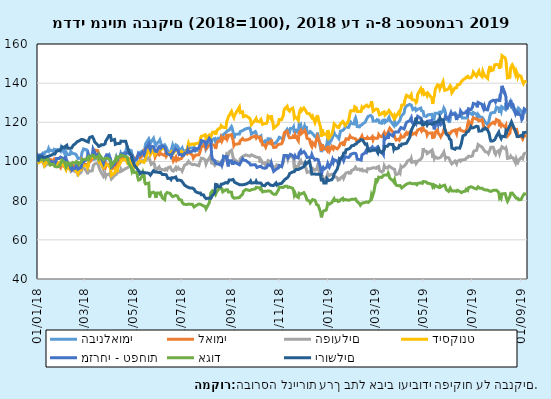
| Category | הבינלאומי | לאומי | הפועלים | דיסקונט | מזרחי - טפחות | אגוד | ירושלים |
|---|---|---|---|---|---|---|---|
| 2018-01-01 | 100 | 100 | 100 | 100 | 100 | 100 | 100 |
| 2018-01-02 | 100.056 | 100.889 | 101.009 | 100.784 | 101.064 | 100 | 102.297 |
| 2018-01-03 | 100.944 | 100.468 | 100.155 | 99.51 | 102.052 | 100.716 | 101.419 |
| 2018-01-04 | 102.75 | 100.749 | 100 | 99.902 | 103.363 | 101.126 | 102.429 |
| 2018-01-07 | 103.778 | 100.562 | 100.039 | 100.588 | 103.363 | 101.126 | 102.429 |
| 2018-01-08 | 104.361 | 100.094 | 99.612 | 100.196 | 103.271 | 100.972 | 102.429 |
| 2018-01-09 | 104.167 | 99.485 | 98.525 | 99.216 | 101.188 | 100.665 | 102.019 |
| 2018-01-10 | 104.056 | 98.971 | 97.554 | 98.041 | 102.129 | 101.024 | 101.844 |
| 2018-01-11 | 104.889 | 100.421 | 98.059 | 98.825 | 101.666 | 100.972 | 102.312 |
| 2018-01-14 | 105.278 | 101.076 | 99.03 | 100.294 | 101.82 | 101.177 | 102.575 |
| 2018-01-15 | 106.5 | 100.983 | 98.719 | 100.196 | 100.91 | 100.154 | 102.868 |
| 2018-01-16 | 105.347 | 99.672 | 98.525 | 99.119 | 99.969 | 99.13 | 102.868 |
| 2018-01-17 | 105.889 | 99.719 | 99.728 | 98.237 | 100.278 | 98.26 | 102.824 |
| 2018-01-18 | 105.986 | 100.936 | 100.155 | 98.433 | 100 | 98.567 | 103.146 |
| 2018-01-21 | 105.236 | 100.14 | 99.379 | 98.629 | 99.738 | 98.618 | 103.805 |
| 2018-01-22 | 106.25 | 101.029 | 98.447 | 98.041 | 99.506 | 98.311 | 103.819 |
| 2018-01-23 | 105.972 | 100.889 | 98.913 | 97.61 | 98.92 | 97.441 | 103.79 |
| 2018-01-24 | 106.014 | 99.485 | 98.874 | 97.943 | 99.969 | 97.544 | 103.922 |
| 2018-01-25 | 106.014 | 100 | 99.767 | 98.727 | 101.512 | 97.236 | 105.312 |
| 2018-01-28 | 106.125 | 98.877 | 99.185 | 99.412 | 101.512 | 97.441 | 105.517 |
| 2018-01-29 | 106.25 | 97.473 | 98.913 | 99.706 | 101.28 | 97.646 | 105.78 |
| 2018-01-30 | 105.278 | 96.912 | 98.486 | 99.216 | 102.283 | 98.874 | 105.795 |
| 2018-01-31 | 107.222 | 98.409 | 99.379 | 100.294 | 102.792 | 99.232 | 106.614 |
| 2018-02-01 | 106.819 | 97.941 | 98.68 | 98.923 | 101.774 | 100.614 | 107.55 |
| 2018-02-04 | 104.167 | 97.286 | 97.826 | 97.551 | 100.509 | 99.591 | 106.994 |
| 2018-02-05 | 105.292 | 99.438 | 99.573 | 97.561 | 102.592 | 98.823 | 107.682 |
| 2018-02-06 | 103.264 | 98.737 | 98.214 | 95.877 | 101.358 | 97.185 | 107.682 |
| 2018-02-07 | 104.167 | 100.094 | 98.564 | 97.365 | 101.851 | 97.851 | 108.282 |
| 2018-02-08 | 103.458 | 99.672 | 96.7 | 97.228 | 99.398 | 99.335 | 106.819 |
| 2018-02-11 | 103.611 | 97.613 | 96.04 | 95.984 | 97.964 | 98.874 | 106.819 |
| 2018-02-12 | 105.139 | 96.865 | 95.109 | 97.444 | 96.467 | 98.26 | 106.848 |
| 2018-02-13 | 104.806 | 97.941 | 95.652 | 96.572 | 95.819 | 97.799 | 106.848 |
| 2018-02-14 | 104.167 | 98.643 | 95.924 | 96.68 | 96.791 | 99.335 | 106.848 |
| 2018-02-15 | 104.222 | 97.146 | 95.342 | 96.376 | 96.189 | 98.976 | 108.282 |
| 2018-02-18 | 103.792 | 97.613 | 94.759 | 95.612 | 96.591 | 99.232 | 109.204 |
| 2018-02-19 | 103.25 | 96.256 | 95.031 | 95.495 | 98.889 | 100 | 109.541 |
| 2018-02-20 | 102.5 | 95.788 | 94.682 | 94.329 | 97.516 | 100.307 | 110.14 |
| 2018-02-21 | 101.528 | 97.333 | 93.245 | 93.692 | 96.081 | 99.591 | 110.433 |
| 2018-02-22 | 101.167 | 97.239 | 93.556 | 95.397 | 96.297 | 98.567 | 110.433 |
| 2018-02-25 | 101.819 | 96.584 | 94.526 | 95.886 | 96.961 | 99.591 | 111.209 |
| 2018-02-26 | 104.556 | 100.281 | 96.661 | 97.571 | 98.889 | 100.972 | 111.37 |
| 2018-02-27 | 105.306 | 99.86 | 98.214 | 97.914 | 99.506 | 100.921 | 111.238 |
| 2018-02-28 | 106.417 | 98.643 | 96.661 | 97.943 | 99.383 | 101.075 | 111.355 |
| 2018-03-04 | 105.944 | 98.409 | 94.915 | 97.816 | 101.049 | 101.228 | 110.258 |
| 2018-03-05 | 104.583 | 96.678 | 93.517 | 96.895 | 102.715 | 101.791 | 109.95 |
| 2018-03-06 | 102.819 | 98.971 | 95.613 | 97.943 | 103.826 | 102.354 | 109.95 |
| 2018-03-07 | 102.764 | 99.438 | 94.953 | 101.763 | 102.376 | 101.331 | 111.735 |
| 2018-03-08 | 102.792 | 99.813 | 94.488 | 102.253 | 102.869 | 102.252 | 112.365 |
| 2018-03-11 | 102.778 | 101.404 | 95.264 | 102.84 | 103.209 | 103.173 | 112.745 |
| 2018-03-12 | 102.222 | 103.884 | 97.516 | 101.959 | 106.341 | 103.224 | 112.73 |
| 2018-03-13 | 101.153 | 104.913 | 98.408 | 102.351 | 105.446 | 102.917 | 111.296 |
| 2018-03-14 | 101.153 | 105.803 | 98.253 | 101.861 | 104.782 | 101.945 | 110.053 |
| 2018-03-15 | 101.25 | 105.943 | 98.913 | 102.057 | 102.592 | 102.201 | 110.287 |
| 2018-03-18 | 101.417 | 105.522 | 98.991 | 102.351 | 103.656 | 102.508 | 108.414 |
| 2018-03-19 | 100.597 | 102.246 | 97.593 | 100.686 | 102.36 | 101.638 | 107.726 |
| 2018-03-20 | 100.694 | 101.778 | 97.127 | 101.567 | 103.132 | 103.429 | 107.55 |
| 2018-03-21 | 100.653 | 100.608 | 95.264 | 99.706 | 102.592 | 102.764 | 107.96 |
| 2018-03-22 | 99.083 | 100.562 | 95.458 | 98.727 | 102.067 | 102.508 | 108.516 |
| 2018-03-25 | 96.25 | 96.912 | 92.391 | 96.817 | 99.213 | 100.819 | 108.516 |
| 2018-03-26 | 97.528 | 98.409 | 92.624 | 96.474 | 101.049 | 100.972 | 108.575 |
| 2018-03-27 | 100.042 | 99.345 | 93.944 | 97.649 | 101.743 | 101.586 | 108.955 |
| 2018-03-28 | 99.653 | 97.567 | 92.352 | 97.453 | 102.237 | 101.586 | 110.536 |
| 2018-03-29 | 102.639 | 98.783 | 93.323 | 98.531 | 103.409 | 101.689 | 111.092 |
| 2018-04-01 | 103.583 | 98.222 | 93.284 | 97.806 | 102.962 | 101.279 | 113.243 |
| 2018-04-02 | 102.236 | 98.269 | 93.905 | 97.62 | 101.82 | 100.921 | 112.965 |
| 2018-04-03 | 101.528 | 98.783 | 93.905 | 96.259 | 100.879 | 100.051 | 113.243 |
| 2018-04-04 | 97.639 | 96.069 | 91.071 | 92.899 | 97.161 | 97.902 | 110.77 |
| 2018-04-08 | 99.611 | 96.912 | 92.896 | 94.123 | 98.72 | 100.154 | 111.253 |
| 2018-04-09 | 99.403 | 96.912 | 92.663 | 94.995 | 100.339 | 100.665 | 108.765 |
| 2018-04-10 | 100.931 | 98.315 | 93.323 | 97.062 | 101.82 | 101.894 | 109.189 |
| 2018-04-11 | 100.056 | 98.315 | 93.012 | 94.594 | 100.278 | 101.075 | 109.116 |
| 2018-04-12 | 101.806 | 99.672 | 94.526 | 96.964 | 102.237 | 102.201 | 109.277 |
| 2018-04-15 | 102.042 | 99.719 | 94.72 | 99.119 | 102.592 | 102.508 | 109.277 |
| 2018-04-16 | 104.167 | 101.263 | 96.002 | 100.098 | 103.811 | 103.275 | 110.404 |
| 2018-04-17 | 103.389 | 100.842 | 95.109 | 100.686 | 103.425 | 103.122 | 110.316 |
| 2018-04-22 | 105.056 | 101.919 | 96.39 | 101.077 | 103.903 | 102.559 | 110.316 |
| 2018-04-23 | 106.556 | 100.374 | 96.157 | 100.881 | 104.459 | 102.508 | 108.984 |
| 2018-04-24 | 106.319 | 100.374 | 96.7 | 99.412 | 104.289 | 102.201 | 107.682 |
| 2018-04-25 | 105.403 | 99.719 | 96.429 | 99.119 | 104.289 | 100.307 | 106.263 |
| 2018-04-26 | 105.972 | 101.451 | 97.244 | 100.881 | 103.78 | 98.772 | 105.092 |
| 2018-04-29 | 105.583 | 101.357 | 97.321 | 99.216 | 103.132 | 96.981 | 103.366 |
| 2018-04-30 | 103.264 | 99.672 | 95.73 | 97.845 | 101.682 | 94.882 | 101.346 |
| 2018-05-01 | 102.708 | 99.626 | 95.807 | 98.041 | 102.438 | 95.701 | 100.234 |
| 2018-05-02 | 101.542 | 100.468 | 97.399 | 98.335 | 102.222 | 95.189 | 100.176 |
| 2018-05-03 | 99.944 | 101.591 | 98.408 | 97.062 | 100.463 | 94.371 | 98.054 |
| 2018-05-06 | 101.111 | 102.012 | 97.904 | 97.943 | 101.342 | 94.626 | 96.517 |
| 2018-05-07 | 102.111 | 102.901 | 99.146 | 98.923 | 102.638 | 92.17 | 95.976 |
| 2018-05-08 | 102.778 | 102.714 | 99.185 | 99.706 | 104.135 | 90.532 | 96.225 |
| 2018-05-09 | 104.292 | 102.667 | 99.922 | 99.804 | 104.459 | 90.43 | 94.966 |
| 2018-05-10 | 104.389 | 101.872 | 99.301 | 100.294 | 103.224 | 90.737 | 93.766 |
| 2018-05-13 | 105.347 | 102.948 | 100.621 | 99.902 | 104.752 | 92.835 | 94.659 |
| 2018-05-14 | 104.444 | 104.82 | 100.932 | 100.098 | 104.227 | 94.524 | 94.952 |
| 2018-05-15 | 104.306 | 105.615 | 100.466 | 99.51 | 103.471 | 93.501 | 94.22 |
| 2018-05-16 | 106.208 | 105.896 | 100.155 | 100.196 | 104.474 | 89.304 | 94.22 |
| 2018-05-17 | 109.028 | 106.551 | 100.543 | 102.253 | 106.464 | 88.536 | 94.235 |
| 2018-05-21 | 111.556 | 107.674 | 102.019 | 106.268 | 108.994 | 88.997 | 94.015 |
| 2018-05-22 | 110.417 | 106.224 | 101.281 | 105.191 | 106.834 | 81.627 | 93.532 |
| 2018-05-23 | 109.306 | 107.347 | 101.281 | 103.428 | 105.97 | 83.828 | 93.064 |
| 2018-05-24 | 109.444 | 106.645 | 98.525 | 103.33 | 107.837 | 83.982 | 92.918 |
| 2018-05-27 | 111.833 | 106.645 | 99.418 | 106.072 | 107.529 | 84.34 | 95.303 |
| 2018-05-28 | 111.653 | 106.645 | 98.758 | 105.681 | 107.081 | 83.879 | 95.04 |
| 2018-05-29 | 108.889 | 102.293 | 96.817 | 103.722 | 105.276 | 83.47 | 94.63 |
| 2018-05-30 | 108.319 | 102.48 | 95.536 | 104.212 | 105.307 | 81.423 | 94.63 |
| 2018-05-31 | 109.292 | 104.024 | 95.536 | 105.289 | 105.091 | 83.93 | 94.615 |
| 2018-06-03 | 110.333 | 103.369 | 97.244 | 106.366 | 107.513 | 83.93 | 94.381 |
| 2018-06-04 | 111.083 | 104.679 | 96.002 | 106.954 | 107.22 | 83.367 | 94.366 |
| 2018-06-05 | 109.806 | 103.837 | 96.429 | 106.464 | 106.773 | 83.879 | 94.381 |
| 2018-06-06 | 107.778 | 103.65 | 96.079 | 106.17 | 106.31 | 83.521 | 94.235 |
| 2018-06-07 | 107.778 | 103.697 | 96.196 | 106.758 | 107.93 | 81.423 | 93.386 |
| 2018-06-10 | 108.569 | 103.042 | 95.536 | 106.562 | 107.297 | 80.502 | 93.371 |
| 2018-06-11 | 108.25 | 104.118 | 96.234 | 106.268 | 106.464 | 83.163 | 92.903 |
| 2018-06-12 | 107.361 | 102.667 | 95.73 | 105.093 | 104.782 | 83.009 | 93.225 |
| 2018-06-13 | 106.264 | 102.246 | 95.691 | 104.799 | 103.826 | 84.186 | 93.064 |
| 2018-06-14 | 105.139 | 103.931 | 96.817 | 103.526 | 103.44 | 84.596 | 91.352 |
| 2018-06-17 | 103.917 | 103.463 | 97.205 | 104.114 | 103.44 | 83.675 | 91.425 |
| 2018-06-18 | 105.472 | 103.837 | 96.312 | 104.016 | 102.453 | 82.907 | 90.825 |
| 2018-06-19 | 105.694 | 102.808 | 95.497 | 105.093 | 102.823 | 82.702 | 91.703 |
| 2018-06-20 | 108.333 | 102.153 | 95.885 | 105.387 | 104.335 | 82.088 | 91.63 |
| 2018-06-21 | 106.972 | 100.281 | 95.109 | 104.31 | 104.767 | 82.497 | 91.63 |
| 2018-06-24 | 108.528 | 102.246 | 96.933 | 105.975 | 106.526 | 82.651 | 92.098 |
| 2018-06-25 | 108.125 | 100.608 | 95.924 | 105.877 | 105.94 | 82.242 | 91.001 |
| 2018-06-26 | 107.972 | 101.076 | 96.002 | 105.289 | 105.446 | 82.344 | 90.357 |
| 2018-06-27 | 107.361 | 101.591 | 96.817 | 105.779 | 105.631 | 81.576 | 90.708 |
| 2018-06-28 | 106.042 | 101.076 | 96.079 | 104.505 | 103.625 | 80.604 | 90.533 |
| 2018-07-01 | 106.333 | 101.544 | 95.963 | 105.191 | 103.595 | 80.348 | 90.225 |
| 2018-07-02 | 106.944 | 101.731 | 95.148 | 105.191 | 102.977 | 79.171 | 89.699 |
| 2018-07-03 | 105.667 | 102.901 | 96.118 | 104.31 | 103.348 | 78.864 | 89.713 |
| 2018-07-04 | 104.875 | 103.182 | 96.584 | 104.016 | 103.163 | 78.199 | 88.543 |
| 2018-07-05 | 105.389 | 104.352 | 98.175 | 104.016 | 104.181 | 77.738 | 87.943 |
| 2018-07-08 | 105.972 | 103.837 | 98.68 | 105.583 | 104.674 | 77.994 | 87.123 |
| 2018-07-09 | 106.583 | 105.288 | 99.495 | 107.738 | 106.001 | 78.147 | 87.079 |
| 2018-07-10 | 107.403 | 105.803 | 100.078 | 109.403 | 104.782 | 78.301 | 86.757 |
| 2018-07-11 | 106.819 | 104.445 | 99.262 | 108.423 | 104.397 | 78.147 | 86.626 |
| 2018-07-12 | 107.222 | 104.352 | 99.146 | 108.913 | 104.813 | 78.147 | 86.435 |
| 2018-07-15 | 106.944 | 103.229 | 98.37 | 109.011 | 105.338 | 78.147 | 86.435 |
| 2018-07-16 | 106.528 | 101.778 | 98.408 | 109.011 | 105.677 | 77.277 | 86.64 |
| 2018-07-17 | 107.361 | 102.34 | 98.525 | 108.521 | 106.248 | 76.766 | 85.85 |
| 2018-07-18 | 106.264 | 102.808 | 98.408 | 109.011 | 105.677 | 76.868 | 85.177 |
| 2018-07-19 | 105.569 | 103.276 | 98.331 | 109.207 | 106.449 | 77.38 | 84.548 |
| 2018-07-23 | 105.792 | 103.416 | 97.865 | 109.305 | 106.788 | 78.301 | 83.86 |
| 2018-07-24 | 106.944 | 104.352 | 99.418 | 109.892 | 108.13 | 78.045 | 83.816 |
| 2018-07-25 | 107.778 | 105.803 | 100.349 | 111.655 | 108.886 | 78.147 | 83.889 |
| 2018-07-26 | 109.028 | 107.394 | 101.708 | 112.831 | 110.691 | 77.789 | 83.055 |
| 2018-07-29 | 110.014 | 107.861 | 101.436 | 113.222 | 110.29 | 77.277 | 82.953 |
| 2018-07-30 | 110.292 | 108.985 | 101.708 | 113.614 | 110.691 | 77.175 | 81.958 |
| 2018-07-31 | 109.681 | 107.628 | 100.738 | 113.614 | 110.043 | 76.97 | 81.738 |
| 2018-08-01 | 106.25 | 106.458 | 98.797 | 111.851 | 108.362 | 75.844 | 81.051 |
| 2018-08-02 | 106.431 | 106.972 | 99.845 | 111.557 | 109.55 | 76.049 | 81.08 |
| 2018-08-05 | 108.819 | 108.329 | 101.708 | 113.516 | 111.802 | 78.864 | 81.329 |
| 2018-08-06 | 109.083 | 108.47 | 102.329 | 113.222 | 111.694 | 80.962 | 81.212 |
| 2018-08-07 | 109.444 | 108.563 | 103.183 | 112.537 | 110.737 | 83.982 | 81.212 |
| 2018-08-08 | 110.222 | 108.517 | 98.602 | 113.614 | 103.517 | 84.033 | 81.212 |
| 2018-08-09 | 111.222 | 108.563 | 99.845 | 114.887 | 101.311 | 85.005 | 82.616 |
| 2018-08-12 | 111.736 | 108.189 | 98.02 | 115.083 | 100.432 | 84.135 | 84.094 |
| 2018-08-13 | 109.819 | 106.411 | 98.02 | 113.614 | 99.044 | 83.214 | 88.308 |
| 2018-08-14 | 109.028 | 108.563 | 99.146 | 115.181 | 98.858 | 84.084 | 88.513 |
| 2018-08-15 | 110.764 | 109.64 | 99.961 | 114.985 | 98.858 | 84.289 | 88.147 |
| 2018-08-16 | 111.847 | 110.295 | 100.116 | 116.454 | 98.565 | 85.517 | 87.065 |
| 2018-08-19 | 111.819 | 110.295 | 99.185 | 117.14 | 98.272 | 86.336 | 87.065 |
| 2018-08-20 | 112.917 | 111.839 | 99.495 | 118.315 | 99.259 | 86.438 | 88.382 |
| 2018-08-21 | 112.361 | 110.482 | 98.408 | 117.826 | 98.118 | 86.131 | 87.987 |
| 2018-08-22 | 112.361 | 110.108 | 98.447 | 117.532 | 99.537 | 84.493 | 88.484 |
| 2018-08-23 | 113.764 | 112.307 | 101.087 | 117.826 | 102.669 | 84.442 | 88.908 |
| 2018-08-26 | 114.931 | 111.558 | 101.242 | 117.238 | 102.129 | 85.619 | 89.26 |
| 2018-08-27 | 115.278 | 114.085 | 103.921 | 120.47 | 103.193 | 86.029 | 88.835 |
| 2018-08-28 | 115.722 | 111.839 | 103.688 | 121.352 | 99.059 | 85.619 | 88.996 |
| 2018-08-29 | 115.986 | 112.775 | 103.416 | 122.723 | 97.501 | 84.442 | 89.508 |
| 2018-08-30 | 116.014 | 113.383 | 104.891 | 123.408 | 100.417 | 84.34 | 90.562 |
| 2018-09-02 | 117.847 | 113.711 | 105.745 | 125.563 | 100.417 | 84.34 | 90.562 |
| 2018-09-03 | 116.847 | 111.979 | 105.396 | 124.192 | 98.966 | 82.19 | 90.825 |
| 2018-09-04 | 114.833 | 110.997 | 101.98 | 124.486 | 99.275 | 82.344 | 90.825 |
| 2018-09-05 | 111.819 | 108.095 | 99.534 | 122.429 | 99.044 | 81.269 | 90.386 |
| 2018-09-06 | 113.889 | 108.751 | 100.932 | 123.702 | 99.661 | 81.627 | 89.362 |
| 2018-09-12 | 114.042 | 109.125 | 99.107 | 127.816 | 98.334 | 81.576 | 88.162 |
| 2018-09-13 | 115.278 | 110.622 | 101.436 | 124.976 | 98.812 | 82.19 | 88.279 |
| 2018-09-16 | 115.792 | 111.699 | 102.562 | 125.367 | 101.388 | 83.316 | 88.118 |
| 2018-09-17 | 115.333 | 111.044 | 102.756 | 122.919 | 100.756 | 84.749 | 87.811 |
| 2018-09-20 | 116.736 | 110.903 | 103.377 | 123.408 | 100.494 | 85.722 | 88.396 |
| 2018-09-25 | 117.125 | 111.558 | 102.679 | 122.037 | 98.982 | 85.159 | 89.479 |
| 2018-09-26 | 115.903 | 112.12 | 102.873 | 121.058 | 98.226 | 85.312 | 90.035 |
| 2018-09-27 | 114.014 | 112.26 | 103.416 | 118.805 | 98.303 | 85.619 | 89.025 |
| 2018-10-02 | 115.278 | 113.009 | 102.446 | 121.254 | 98.349 | 86.029 | 89.157 |
| 2018-10-03 | 114.403 | 112.073 | 102.562 | 121.939 | 98.673 | 86.796 | 89.962 |
| 2018-10-04 | 112.361 | 112.775 | 102.174 | 120.568 | 96.945 | 86.694 | 89.069 |
| 2018-10-07 | 112.458 | 112.307 | 101.941 | 120.274 | 97.439 | 86.592 | 89.055 |
| 2018-10-08 | 112.306 | 111.184 | 99.457 | 120.274 | 96.945 | 85.977 | 88.879 |
| 2018-10-09 | 113.056 | 111.745 | 100.854 | 121.45 | 97.532 | 86.54 | 88.967 |
| 2018-10-10 | 110.278 | 110.154 | 100.311 | 120.274 | 97.516 | 86.285 | 88.952 |
| 2018-10-11 | 109.569 | 108.47 | 98.991 | 119.001 | 96.745 | 84.493 | 87.811 |
| 2018-10-14 | 110.486 | 108.329 | 99.301 | 119.393 | 96.56 | 84.8 | 87.621 |
| 2018-10-15 | 109.528 | 107.394 | 97.981 | 119.491 | 96.051 | 85.005 | 87.621 |
| 2018-10-16 | 109.847 | 108.47 | 98.952 | 119.491 | 96.822 | 84.8 | 88.689 |
| 2018-10-17 | 110 | 108.563 | 99.612 | 120.176 | 97.701 | 85.107 | 88.543 |
| 2018-10-18 | 111.639 | 109.686 | 100.466 | 123.115 | 98.426 | 84.954 | 88.952 |
| 2018-10-21 | 111.458 | 109.125 | 99.922 | 122.037 | 97.794 | 84.852 | 87.913 |
| 2018-10-22 | 111.944 | 111.184 | 100.155 | 123.604 | 99.136 | 85.005 | 88.221 |
| 2018-10-23 | 109.028 | 109.172 | 98.214 | 120.96 | 97.424 | 83.828 | 87.796 |
| 2018-10-24 | 109.028 | 108.563 | 97.05 | 120.078 | 97.115 | 83.828 | 87.796 |
| 2018-10-25 | 109.167 | 107.16 | 96.661 | 117.042 | 94.955 | 83.316 | 87.796 |
| 2018-10-28 | 109.556 | 107.3 | 97.438 | 118.022 | 96.02 | 83.316 | 89.025 |
| 2018-10-29 | 109.722 | 108.095 | 98.214 | 117.63 | 96.39 | 84.084 | 87.957 |
| 2018-10-31 | 111.375 | 108.657 | 97.826 | 119.197 | 96.699 | 85.415 | 88.484 |
| 2018-11-01 | 112.361 | 108.985 | 97.438 | 121.45 | 97.933 | 86.899 | 88.821 |
| 2018-11-04 | 111.875 | 109.078 | 97.36 | 121.352 | 97.377 | 86.796 | 88.835 |
| 2018-11-05 | 111.542 | 109.78 | 97.748 | 121.45 | 98.936 | 86.796 | 89.04 |
| 2018-11-06 | 111.111 | 111.839 | 99.379 | 123.31 | 100.586 | 86.745 | 89.874 |
| 2018-11-07 | 112.375 | 114.085 | 101.669 | 126.151 | 103.055 | 86.847 | 90.196 |
| 2018-11-08 | 114.583 | 114.927 | 102.834 | 126.934 | 103.44 | 87.359 | 90.781 |
| 2018-11-11 | 116.444 | 115.489 | 102.562 | 128.208 | 103.008 | 87.308 | 91.645 |
| 2018-11-12 | 115.694 | 113.758 | 100.97 | 126.543 | 101.851 | 86.745 | 91.747 |
| 2018-11-13 | 115.389 | 112.775 | 102.096 | 126.934 | 102.438 | 87.001 | 92.61 |
| 2018-11-14 | 114.944 | 112.073 | 102.368 | 125.759 | 102.746 | 86.95 | 93.81 |
| 2018-11-15 | 116.833 | 111.839 | 102.679 | 126.543 | 103.656 | 86.54 | 94.191 |
| 2018-11-18 | 116.958 | 112.26 | 102.019 | 127.228 | 102.977 | 86.285 | 94.674 |
| 2018-11-19 | 117.667 | 113.711 | 102.873 | 125.661 | 103.317 | 85.261 | 94.82 |
| 2018-11-20 | 114.486 | 111.605 | 97.089 | 122.331 | 101.82 | 82.805 | 94.805 |
| 2018-11-21 | 116.653 | 113.477 | 97.826 | 122.919 | 102.9 | 83.623 | 95.113 |
| 2018-11-22 | 115.278 | 112.635 | 97.787 | 122.429 | 102.175 | 82.446 | 95.888 |
| 2018-11-25 | 114.833 | 110.622 | 96.894 | 121.058 | 101.82 | 81.627 | 95.888 |
| 2018-11-26 | 119 | 114.693 | 99.495 | 124.29 | 104.289 | 83.777 | 96.269 |
| 2018-11-27 | 118.125 | 114.506 | 99.922 | 126.053 | 104.906 | 83.419 | 96.283 |
| 2018-11-28 | 118.722 | 115.77 | 100.505 | 126.738 | 105.523 | 83.316 | 96.576 |
| 2018-11-29 | 116.389 | 114.272 | 98.991 | 125.857 | 104.212 | 83.47 | 96.722 |
| 2018-12-02 | 116.917 | 115.349 | 99.301 | 127.326 | 105.045 | 84.084 | 97.351 |
| 2018-12-03 | 118.194 | 115.863 | 98.835 | 127.816 | 105.045 | 83.93 | 97.556 |
| 2018-12-04 | 117.125 | 115.021 | 97.127 | 126.151 | 104.042 | 82.651 | 99.488 |
| 2018-12-05 | 118.056 | 113.664 | 96.079 | 126.347 | 104.443 | 81.525 | 98.771 |
| 2018-12-06 | 114.25 | 111.792 | 94.449 | 124.584 | 102.067 | 80.297 | 98.771 |
| 2018-12-09 | 114.722 | 111.371 | 94.837 | 124.388 | 102.175 | 79.836 | 100.337 |
| 2018-12-10 | 115.278 | 109.686 | 94.915 | 124.388 | 102.607 | 78.864 | 98.347 |
| 2018-12-11 | 115.111 | 108.423 | 94.022 | 123.017 | 102.083 | 79.427 | 96.327 |
| 2018-12-12 | 114.639 | 107.674 | 94.992 | 122.429 | 103.487 | 80.041 | 93.606 |
| 2018-12-13 | 114.167 | 109.499 | 96.467 | 123.115 | 102.345 | 80.553 | 93.649 |
| 2018-12-16 | 112.722 | 108.095 | 95.497 | 119.882 | 100.771 | 80.194 | 93.562 |
| 2018-12-17 | 112.222 | 110.108 | 95.963 | 121.156 | 101.203 | 79.324 | 93.562 |
| 2018-12-18 | 112.014 | 110.482 | 96.079 | 121.156 | 101.203 | 77.994 | 93.518 |
| 2018-12-19 | 114.722 | 112.728 | 97.516 | 123.702 | 101.512 | 77.943 | 93.796 |
| 2018-12-20 | 112.611 | 113.009 | 97.05 | 121.743 | 100.895 | 77.636 | 93.547 |
| 2018-12-23 | 107.042 | 108.563 | 92.857 | 117.532 | 96.729 | 74.002 | 93.284 |
| 2018-12-24 | 104.792 | 105.335 | 89.674 | 112.635 | 92.873 | 71.494 | 90.752 |
| 2018-12-25 | 107.667 | 108.797 | 92.896 | 116.357 | 96.267 | 73.081 | 90.752 |
| 2018-12-26 | 107.222 | 108.797 | 93.362 | 114.887 | 96.884 | 74.258 | 90.752 |
| 2018-12-27 | 106.25 | 106.738 | 90.567 | 113.81 | 96.02 | 74.77 | 89.069 |
| 2018-12-30 | 107.319 | 106.317 | 91.304 | 114.202 | 96.868 | 75.179 | 89.069 |
| 2018-12-31 | 109.167 | 105.756 | 91.809 | 113.222 | 97.408 | 76.51 | 91.294 |
| 2019-01-01 | 111.944 | 108.002 | 93.711 | 116.063 | 98.828 | 78.71 | 91.513 |
| 2019-01-02 | 110.153 | 106.224 | 92.702 | 114.3 | 97.67 | 78.301 | 90.284 |
| 2019-01-03 | 109.069 | 105.194 | 92.197 | 112.243 | 97.007 | 78.199 | 90.591 |
| 2019-01-06 | 111.208 | 107.628 | 93.517 | 113.908 | 99.522 | 78.966 | 90.679 |
| 2019-01-07 | 112.361 | 107.019 | 93.634 | 113.908 | 100.895 | 79.683 | 90.855 |
| 2019-01-08 | 112.403 | 106.411 | 92.935 | 116.748 | 99.661 | 80.399 | 91.879 |
| 2019-01-09 | 114.708 | 107.487 | 93.129 | 119.197 | 100.895 | 81.013 | 93.649 |
| 2019-01-10 | 113.694 | 107.394 | 92.275 | 118.707 | 101.234 | 79.99 | 93.81 |
| 2019-01-13 | 112.736 | 106.458 | 91.693 | 117.532 | 100.201 | 80.297 | 96.166 |
| 2019-01-14 | 112.778 | 106.224 | 90.489 | 117.826 | 99.013 | 79.58 | 97.673 |
| 2019-01-15 | 111.667 | 107.44 | 90.528 | 117.336 | 100.694 | 79.376 | 99.532 |
| 2019-01-16 | 113.542 | 107.861 | 90.8 | 118.511 | 99.877 | 79.836 | 99.781 |
| 2019-01-17 | 115.486 | 109.219 | 91.537 | 119.197 | 101.496 | 80.45 | 101.449 |
| 2019-01-20 | 115.889 | 109.64 | 92.508 | 120.47 | 101.496 | 81.218 | 102.853 |
| 2019-01-21 | 115.444 | 107.908 | 91.421 | 119.882 | 100.432 | 80.194 | 104.317 |
| 2019-01-22 | 116.681 | 109.312 | 92.314 | 119.98 | 101.589 | 79.99 | 104.331 |
| 2019-01-23 | 117.75 | 110.435 | 93.595 | 118.413 | 102.438 | 80.604 | 104.287 |
| 2019-01-24 | 117.25 | 111.605 | 94.138 | 119.001 | 101.944 | 80.604 | 106.014 |
| 2019-01-27 | 117.375 | 111.277 | 94.526 | 120.666 | 102.036 | 80.194 | 106.38 |
| 2019-01-28 | 118.194 | 111.605 | 93.944 | 122.429 | 102.036 | 80.348 | 106.541 |
| 2019-01-29 | 119.319 | 113.009 | 94.138 | 124.682 | 102.746 | 80.399 | 106.833 |
| 2019-01-30 | 120 | 112.307 | 94.138 | 125.955 | 103.703 | 80.809 | 107.009 |
| 2019-01-31 | 119.375 | 112.26 | 95.458 | 125.661 | 104.15 | 80.706 | 108.019 |
| 2019-02-03 | 119.167 | 111.839 | 95.963 | 125.857 | 104.212 | 80.655 | 108.209 |
| 2019-02-04 | 121.194 | 111.699 | 96.157 | 127.914 | 104.011 | 80.809 | 108.721 |
| 2019-02-05 | 122.222 | 111.605 | 97.127 | 128.404 | 104.119 | 80.911 | 108.984 |
| 2019-02-06 | 120.833 | 110.716 | 96.856 | 127.326 | 103.348 | 80.143 | 109.014 |
| 2019-02-07 | 117.847 | 110.482 | 95.924 | 125.563 | 101.142 | 79.529 | 109.643 |
| 2019-02-10 | 117.667 | 110.997 | 96.157 | 125.465 | 101.018 | 78.454 | 110.433 |
| 2019-02-11 | 118.472 | 111.418 | 95.575 | 125.759 | 101.018 | 77.687 | 110.594 |
| 2019-02-12 | 118.667 | 112.26 | 95.691 | 125.563 | 100.741 | 78.199 | 111.209 |
| 2019-02-13 | 118.708 | 113.009 | 96.002 | 127.62 | 103.379 | 78.71 | 110.872 |
| 2019-02-14 | 119.264 | 111.699 | 95.186 | 127.032 | 103.826 | 78.915 | 110.872 |
| 2019-02-17 | 120.028 | 111.745 | 95.303 | 128.208 | 104.443 | 79.12 | 108.838 |
| 2019-02-18 | 120.931 | 111.839 | 94.915 | 128.208 | 105.338 | 79.427 | 108.999 |
| 2019-02-19 | 121.361 | 111.652 | 94.876 | 128.795 | 104.813 | 79.376 | 108.984 |
| 2019-02-20 | 122.583 | 112.307 | 96.273 | 128.893 | 105.924 | 79.58 | 108.984 |
| 2019-02-21 | 123.111 | 111.745 | 96.39 | 127.914 | 106.449 | 79.069 | 105.341 |
| 2019-02-24 | 123.514 | 111.745 | 96.351 | 128.697 | 106.68 | 80.297 | 105.356 |
| 2019-02-25 | 123.889 | 112.026 | 96.196 | 130.754 | 106.942 | 82.907 | 105.429 |
| 2019-02-26 | 122.681 | 112.681 | 96.7 | 128.208 | 107.467 | 81.883 | 105.751 |
| 2019-02-27 | 120.625 | 111.137 | 96.661 | 125.661 | 106.68 | 82.139 | 105.751 |
| 2019-02-28 | 120.694 | 112.167 | 96.856 | 125.465 | 107.097 | 84.442 | 105.751 |
| 2019-03-03 | 120.722 | 111.792 | 96.506 | 126.836 | 106.757 | 91.505 | 105.882 |
| 2019-03-04 | 121.361 | 112.167 | 97.089 | 126.934 | 107.019 | 89.867 | 105.399 |
| 2019-03-05 | 121.806 | 111.979 | 96.972 | 126.543 | 107.529 | 90.532 | 104.419 |
| 2019-03-06 | 121.111 | 113.711 | 97.438 | 126.347 | 106.896 | 92.016 | 106.175 |
| 2019-03-07 | 119.861 | 113.102 | 95.536 | 123.8 | 105.214 | 92.119 | 105.209 |
| 2019-03-10 | 119.542 | 112.635 | 94.604 | 124.388 | 104.952 | 91.863 | 104.404 |
| 2019-03-11 | 121.306 | 113.243 | 94.72 | 125.073 | 104.597 | 91.863 | 105.034 |
| 2019-03-12 | 119.514 | 113.664 | 95.303 | 124.78 | 103.579 | 92.886 | 105.312 |
| 2019-03-13 | 121.764 | 114.787 | 97.787 | 125.367 | 112.095 | 93.142 | 106.087 |
| 2019-03-14 | 119.972 | 113.711 | 96.972 | 123.702 | 111.308 | 93.142 | 107.711 |
| 2019-03-17 | 120.931 | 114.272 | 96.623 | 124.878 | 112.82 | 92.989 | 107.741 |
| 2019-03-18 | 120.833 | 114.74 | 97.05 | 125.073 | 111.54 | 94.063 | 107.755 |
| 2019-03-19 | 122.5 | 116.004 | 97.632 | 126.053 | 114.27 | 93.04 | 108.838 |
| 2019-03-20 | 121.111 | 116.94 | 97.787 | 125.759 | 113.792 | 91.505 | 108.853 |
| 2019-03-24 | 119.028 | 115.021 | 96.273 | 123.115 | 112.959 | 90.123 | 108.677 |
| 2019-03-25 | 118.472 | 113.945 | 95.846 | 122.233 | 113.005 | 89.56 | 106.321 |
| 2019-03-26 | 120.694 | 112.915 | 96.002 | 123.408 | 114.934 | 90.686 | 107.272 |
| 2019-03-27 | 119.736 | 111.652 | 93.944 | 122.429 | 115.088 | 88.997 | 107.272 |
| 2019-03-28 | 118.708 | 110.95 | 93.284 | 122.723 | 115.088 | 87.922 | 106.409 |
| 2019-03-31 | 120.028 | 111.465 | 93.75 | 125.073 | 115.088 | 87.615 | 106.921 |
| 2019-04-01 | 120.417 | 110.95 | 94.915 | 124.388 | 116.014 | 88.025 | 108.267 |
| 2019-04-02 | 121.181 | 111.933 | 94.255 | 124.388 | 115.72 | 87.718 | 108.019 |
| 2019-04-03 | 122.958 | 113.102 | 97.438 | 126.934 | 117.325 | 87.615 | 108.092 |
| 2019-04-04 | 123.361 | 112.354 | 96.894 | 128.795 | 116.831 | 86.489 | 108.941 |
| 2019-04-07 | 124.722 | 112.588 | 97.632 | 128.991 | 116.631 | 87.462 | 108.999 |
| 2019-04-08 | 127.139 | 113.711 | 97.943 | 131.44 | 117.078 | 87.564 | 109.058 |
| 2019-04-10 | 128.361 | 114.74 | 99.107 | 133.79 | 120.009 | 88.434 | 109.35 |
| 2019-04-11 | 128.389 | 113.945 | 100.155 | 133.301 | 120.333 | 88.792 | 109.716 |
| 2019-04-14 | 129.181 | 114.974 | 100.854 | 132.713 | 120.781 | 89.048 | 112.248 |
| 2019-04-15 | 128.764 | 114.319 | 100.311 | 132.713 | 120.642 | 88.639 | 114.486 |
| 2019-04-16 | 128.764 | 115.302 | 101.475 | 134.084 | 122.354 | 88.792 | 115.818 |
| 2019-04-17 | 127.778 | 113.711 | 99.573 | 131.636 | 120.102 | 88.69 | 115.745 |
| 2019-04-18 | 126.514 | 113.243 | 99.651 | 131.44 | 119.485 | 88.639 | 117.632 |
| 2019-04-21 | 127.208 | 114.6 | 100.078 | 131.244 | 120.333 | 88.741 | 119.696 |
| 2019-04-22 | 126.014 | 114.038 | 98.913 | 130.069 | 119.562 | 88.588 | 122.403 |
| 2019-04-23 | 126.181 | 114.319 | 98.874 | 130.656 | 121.66 | 88.127 | 119.842 |
| 2019-04-24 | 126.639 | 116.051 | 100.155 | 134.28 | 123.11 | 88.843 | 119.842 |
| 2019-04-28 | 127.278 | 116.752 | 101.203 | 137.12 | 122.077 | 89.099 | 119.681 |
| 2019-04-29 | 125.889 | 115.629 | 101.747 | 135.749 | 120.333 | 89.406 | 120.457 |
| 2019-04-30 | 125.486 | 115.161 | 102.679 | 137.316 | 120.009 | 88.843 | 118.701 |
| 2019-05-01 | 125.556 | 116.986 | 106.793 | 137.12 | 120.333 | 89.765 | 118.803 |
| 2019-05-02 | 123.264 | 115.91 | 105.396 | 134.182 | 119.67 | 89.867 | 118.803 |
| 2019-05-05 | 123.056 | 115.395 | 105.202 | 134.868 | 120.102 | 89.509 | 119.988 |
| 2019-05-06 | 122.569 | 113.57 | 104.037 | 133.692 | 119.176 | 88.997 | 118.73 |
| 2019-05-07 | 123.847 | 114.413 | 104.193 | 134.77 | 120.595 | 89.048 | 119.257 |
| 2019-05-12 | 124.097 | 114.6 | 105.784 | 132.321 | 120.95 | 88.383 | 119.257 |
| 2019-05-13 | 121.181 | 111.558 | 101.902 | 129.383 | 118.189 | 87.103 | 119.593 |
| 2019-05-14 | 122.917 | 113.664 | 103.261 | 132.615 | 119.639 | 87.769 | 119.286 |
| 2019-05-15 | 122.347 | 112.307 | 101.553 | 133.203 | 116.461 | 87.052 | 119.974 |
| 2019-05-16 | 124.597 | 114.834 | 102.446 | 136.631 | 118.204 | 87.82 | 119.798 |
| 2019-05-19 | 124.583 | 116.051 | 101.63 | 139.177 | 120.333 | 87.052 | 120.266 |
| 2019-05-20 | 124.722 | 114.319 | 101.669 | 139.177 | 118.945 | 87.001 | 120.281 |
| 2019-05-21 | 124.236 | 113.851 | 101.786 | 138.883 | 120.349 | 86.745 | 120.281 |
| 2019-05-22 | 125.875 | 113.43 | 101.747 | 137.12 | 119.67 | 87.564 | 122.3 |
| 2019-05-23 | 124.431 | 112.588 | 102.174 | 136.631 | 118.945 | 86.95 | 121.349 |
| 2019-05-26 | 125.764 | 114.693 | 104.037 | 140.744 | 120.642 | 87.666 | 121.364 |
| 2019-05-27 | 127.222 | 116.285 | 104.814 | 138.198 | 120.827 | 88.025 | 120.939 |
| 2019-05-28 | 126.458 | 116.986 | 104.503 | 136.337 | 121.598 | 87.922 | 116.696 |
| 2019-05-29 | 125 | 115.115 | 101.514 | 136.239 | 123.11 | 87.052 | 115.569 |
| 2019-05-30 | 121.667 | 114.506 | 102.174 | 136.533 | 123.234 | 85.67 | 114.033 |
| 2019-06-02 | 120.819 | 114.46 | 101.902 | 137.12 | 121.567 | 84.749 | 112.95 |
| 2019-06-03 | 119.722 | 113.898 | 101.203 | 138.1 | 122.94 | 84.903 | 111.56 |
| 2019-06-04 | 122.917 | 114.085 | 100.155 | 138.688 | 123.264 | 86.387 | 111.955 |
| 2019-06-05 | 123.806 | 114.834 | 100.155 | 138.002 | 125.039 | 86.131 | 110.872 |
| 2019-06-06 | 124.028 | 115.489 | 98.797 | 135.162 | 124.02 | 84.954 | 106.863 |
| 2019-06-10 | 124.861 | 116.051 | 100.233 | 137.61 | 124.267 | 85.005 | 106.248 |
| 2019-06-11 | 124.833 | 115.723 | 99.573 | 137.12 | 123.079 | 85.005 | 106.877 |
| 2019-06-12 | 123.778 | 114.132 | 98.835 | 137.61 | 121.182 | 84.8 | 106.907 |
| 2019-06-13 | 123.181 | 116.238 | 100.155 | 139.177 | 123.064 | 85.312 | 106.877 |
| 2019-06-16 | 123.194 | 116.799 | 100.738 | 139.373 | 123.156 | 84.698 | 106.819 |
| 2019-06-17 | 123.194 | 115.957 | 100.155 | 140.059 | 125.733 | 84.442 | 107.214 |
| 2019-06-18 | 123.472 | 116.097 | 100.116 | 140.744 | 125.039 | 84.084 | 109.175 |
| 2019-06-19 | 122.208 | 115.629 | 100.854 | 140.353 | 124.545 | 84.289 | 111.238 |
| 2019-06-20 | 121.736 | 115.863 | 100.738 | 141.724 | 124.576 | 84.596 | 113.126 |
| 2019-06-23 | 122.222 | 115.115 | 101.009 | 142.409 | 124.915 | 84.852 | 113.652 |
| 2019-06-24 | 121.833 | 116.004 | 101.708 | 142.997 | 125.486 | 85.824 | 114.413 |
| 2019-06-25 | 122.181 | 116.565 | 101.786 | 143.095 | 124.823 | 85.415 | 115.174 |
| 2019-06-26 | 122.639 | 119.186 | 102.057 | 143.487 | 124.19 | 85.261 | 114.896 |
| 2019-06-27 | 125.292 | 120.543 | 102.717 | 142.703 | 126.921 | 86.643 | 115.364 |
| 2019-06-30 | 124.444 | 118.39 | 102.562 | 142.703 | 126.504 | 87.103 | 117.764 |
| 2019-07-01 | 124.208 | 119.467 | 102.096 | 143.389 | 127.06 | 86.899 | 117.12 |
| 2019-07-02 | 123.833 | 121.526 | 102.873 | 143.976 | 127.846 | 86.796 | 117.12 |
| 2019-07-03 | 125.028 | 122.321 | 104.697 | 145.642 | 129.636 | 86.745 | 117.237 |
| 2019-07-04 | 124.972 | 122.181 | 105.396 | 145.348 | 129.821 | 86.387 | 117.062 |
| 2019-07-07 | 124.125 | 121.666 | 105.668 | 143.487 | 129.127 | 85.977 | 118.042 |
| 2019-07-08 | 122.708 | 121.479 | 106.949 | 143.389 | 127.677 | 86.233 | 117.881 |
| 2019-07-09 | 124.028 | 121.432 | 108.657 | 145.348 | 130.16 | 87.052 | 117.779 |
| 2019-07-10 | 124.306 | 120.73 | 108.502 | 146.131 | 130.253 | 86.643 | 115.511 |
| 2019-07-11 | 122.778 | 121.198 | 108.075 | 144.564 | 129.759 | 86.387 | 115.335 |
| 2019-07-14 | 122.583 | 121.338 | 107.337 | 143.389 | 129.189 | 86.336 | 115.686 |
| 2019-07-15 | 122.917 | 119.747 | 107.065 | 146.033 | 127.707 | 86.029 | 116.594 |
| 2019-07-16 | 121.458 | 117.876 | 106.134 | 145.837 | 126.813 | 85.722 | 116.594 |
| 2019-07-17 | 121.139 | 116.94 | 106.289 | 143.976 | 128.124 | 85.722 | 116.506 |
| 2019-07-18 | 120 | 117.033 | 104.969 | 143.879 | 126.581 | 85.466 | 117.135 |
| 2019-07-21 | 118.875 | 116.94 | 104.736 | 142.409 | 126.35 | 85.415 | 116.052 |
| 2019-07-22 | 119.514 | 116.659 | 104.076 | 145.935 | 128.047 | 85.159 | 115.979 |
| 2019-07-23 | 121.528 | 118.297 | 105.008 | 147.209 | 129.235 | 84.954 | 114.208 |
| 2019-07-24 | 123.403 | 118.858 | 105.978 | 148.776 | 130.361 | 84.749 | 111.794 |
| 2019-07-25 | 124.667 | 118.765 | 107.298 | 146.327 | 130.824 | 84.698 | 110.506 |
| 2019-07-28 | 125.014 | 120.028 | 107.298 | 146.719 | 131.302 | 85.261 | 110.536 |
| 2019-07-29 | 125.306 | 120.496 | 106.211 | 148.09 | 131.009 | 85.722 | 110.521 |
| 2019-07-30 | 125.083 | 119.326 | 104.231 | 149.363 | 131.132 | 85.312 | 111.15 |
| 2019-07-31 | 126.222 | 120.122 | 103.61 | 149.461 | 130.361 | 85.619 | 111.926 |
| 2019-08-01 | 127.764 | 121.432 | 104.814 | 149.559 | 131.364 | 85.363 | 112.906 |
| 2019-08-04 | 127.222 | 120.824 | 105.59 | 149.363 | 131.456 | 84.237 | 114.984 |
| 2019-08-05 | 124.847 | 117.922 | 104.037 | 147.405 | 130.5 | 81.474 | 113.462 |
| 2019-08-06 | 126.472 | 119.279 | 105.357 | 150.147 | 134.202 | 82.088 | 113.404 |
| 2019-08-07 | 125.486 | 118.203 | 105.28 | 149.559 | 134.974 | 81.32 | 111.794 |
| 2019-08-08 | 127.917 | 118.858 | 107.531 | 154.065 | 138.615 | 83.47 | 112.921 |
| 2019-08-12 | 126.667 | 117.548 | 106.405 | 152.889 | 134.372 | 83.623 | 112.687 |
| 2019-08-13 | 129.861 | 118.39 | 106.949 | 151.518 | 132.984 | 83.521 | 115.496 |
| 2019-08-14 | 127.194 | 114.881 | 105.474 | 146.915 | 126.643 | 80.757 | 114.925 |
| 2019-08-15 | 127.75 | 113.009 | 101.592 | 142.703 | 128.355 | 79.683 | 116.037 |
| 2019-08-18 | 129.389 | 114.413 | 101.825 | 142.997 | 129.898 | 82.088 | 118.306 |
| 2019-08-19 | 130.542 | 117.501 | 102.717 | 147.894 | 131.395 | 83.828 | 118.671 |
| 2019-08-20 | 129.319 | 117.595 | 102.057 | 147.992 | 128.278 | 83.828 | 120.252 |
| 2019-08-21 | 127.542 | 118.39 | 102.252 | 149.363 | 128.047 | 83.879 | 120.208 |
| 2019-08-22 | 127.5 | 117.922 | 101.863 | 148.678 | 128.895 | 83.879 | 118.203 |
| 2019-08-25 | 124.583 | 115.115 | 99.301 | 144.564 | 124.653 | 81.781 | 115.569 |
| 2019-08-26 | 125.722 | 117.08 | 101.281 | 146.131 | 125.887 | 81.269 | 114.384 |
| 2019-08-27 | 124.833 | 116.94 | 100.155 | 145.054 | 123.743 | 80.86 | 112.73 |
| 2019-08-28 | 123.514 | 113.243 | 99.495 | 143.095 | 124.961 | 81.218 | 112.73 |
| 2019-08-29 | 127.083 | 112.681 | 100.543 | 144.074 | 125.424 | 80.45 | 112.701 |
| 2019-09-01 | 125.931 | 113.009 | 101.941 | 143.487 | 123.419 | 80.553 | 113.301 |
| 2019-09-02 | 125.111 | 112.775 | 101.863 | 143.291 | 121.382 | 81.372 | 112.804 |
| 2019-09-03 | 125.014 | 111.465 | 101.398 | 140.842 | 121.969 | 81.269 | 112.789 |
| 2019-09-04 | 124.667 | 112.541 | 103.183 | 139.863 | 125.347 | 82.907 | 114.735 |
| 2019-09-05 | 125 | 113.243 | 103.998 | 140.744 | 126.89 | 83.47 | 114.999 |
| 2019-09-08 | 125.556 | 113.149 | 104.464 | 140.94 | 125.902 | 83.419 | 114.999 |